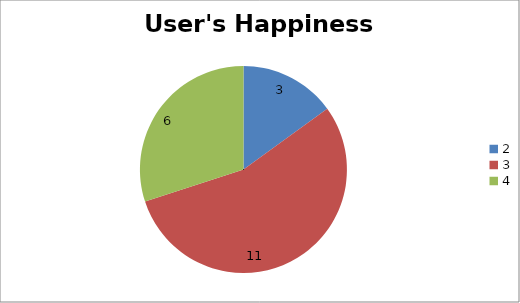
| Category | User's Happiness Rating |
|---|---|
| 2.0 | 3 |
| 3.0 | 11 |
| 4.0 | 6 |